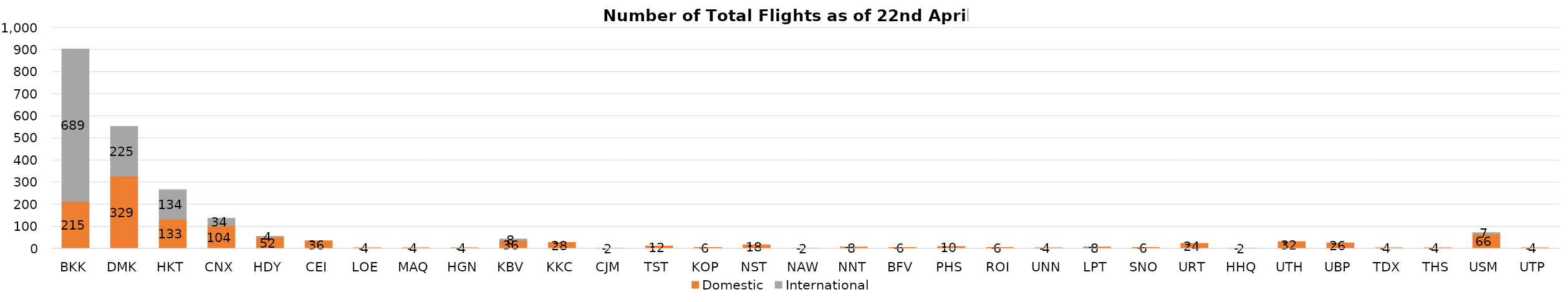
| Category | Domestic | International |
|---|---|---|
| BKK | 215 | 689 |
| DMK | 329 | 225 |
| HKT | 133 | 134 |
| CNX | 104 | 34 |
| HDY | 52 | 4 |
| CEI | 36 | 0 |
| LOE | 4 | 0 |
| MAQ | 4 | 0 |
| HGN | 4 | 0 |
| KBV | 36 | 8 |
| KKC | 28 | 0 |
| CJM | 2 | 0 |
| TST | 12 | 0 |
| KOP | 6 | 0 |
| NST | 18 | 0 |
| NAW | 2 | 0 |
| NNT | 8 | 0 |
| BFV | 6 | 0 |
| PHS | 10 | 0 |
| ROI | 6 | 0 |
| UNN | 4 | 0 |
| LPT | 8 | 0 |
| SNO | 6 | 0 |
| URT | 24 | 0 |
| HHQ | 2 | 0 |
| UTH | 32 | 0 |
| UBP | 26 | 0 |
| TDX | 4 | 0 |
| THS | 4 | 0 |
| USM | 66 | 7 |
| UTP | 4 | 0 |